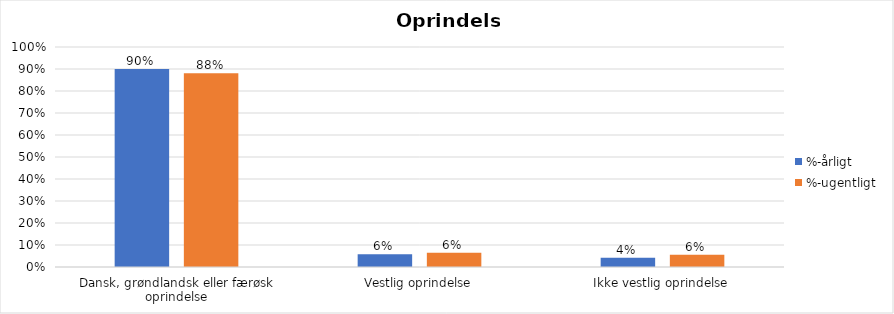
| Category | %-årligt | %-ugentligt |
|---|---|---|
| Dansk, grøndlandsk eller færøsk oprindelse | 0.9 | 0.88 |
| Vestlig oprindelse | 0.058 | 0.065 |
| Ikke vestlig oprindelse | 0.042 | 0.055 |